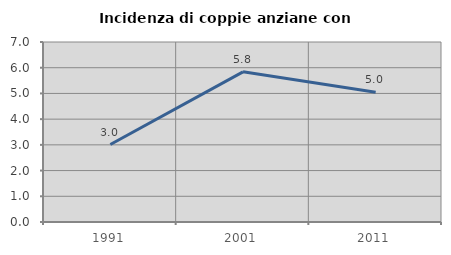
| Category | Incidenza di coppie anziane con figli |
|---|---|
| 1991.0 | 3.012 |
| 2001.0 | 5.839 |
| 2011.0 | 5.042 |